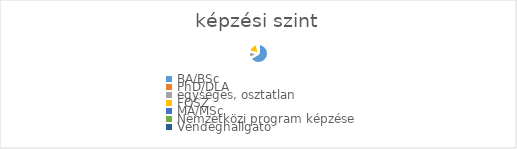
| Category | Series 0 |
|---|---|
| BA/BSc | 410 |
| PhD/DLA | 2 |
| egységes, osztatlan | 74 |
| FOSZ | 117 |
| MA/MSc | 15 |
| Nemzetközi program képzése | 1 |
| Vendéghallgató | 1 |